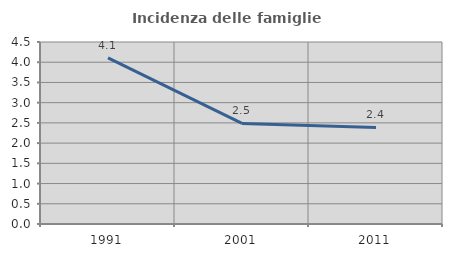
| Category | Incidenza delle famiglie numerose |
|---|---|
| 1991.0 | 4.107 |
| 2001.0 | 2.487 |
| 2011.0 | 2.387 |